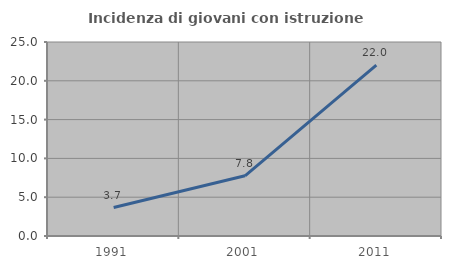
| Category | Incidenza di giovani con istruzione universitaria |
|---|---|
| 1991.0 | 3.672 |
| 2001.0 | 7.756 |
| 2011.0 | 22.021 |